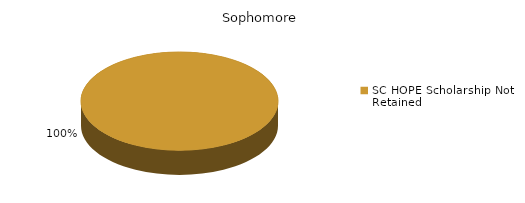
| Category | Sophomore |
|---|---|
| SC HOPE Scholarship Not Retained  | 3 |